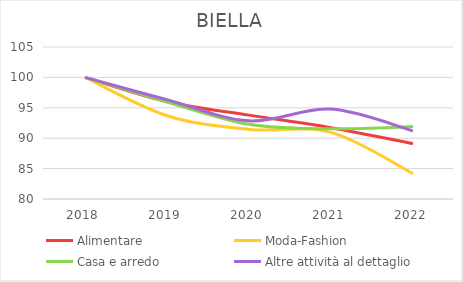
| Category | Alimentare | Moda-Fashion | Casa e arredo | Altre attività al dettaglio |
|---|---|---|---|---|
| 2018.0 | 100 | 100 | 100 | 100 |
| 2019.0 | 96 | 93.7 | 95.956 | 96.329 |
| 2020.0 | 93.793 | 91.438 | 92.279 | 92.85 |
| 2021.0 | 91.724 | 90.953 | 91.544 | 94.783 |
| 2022.0 | 89.103 | 84.168 | 91.912 | 91.208 |